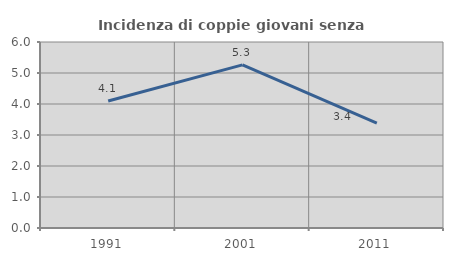
| Category | Incidenza di coppie giovani senza figli |
|---|---|
| 1991.0 | 4.095 |
| 2001.0 | 5.263 |
| 2011.0 | 3.386 |